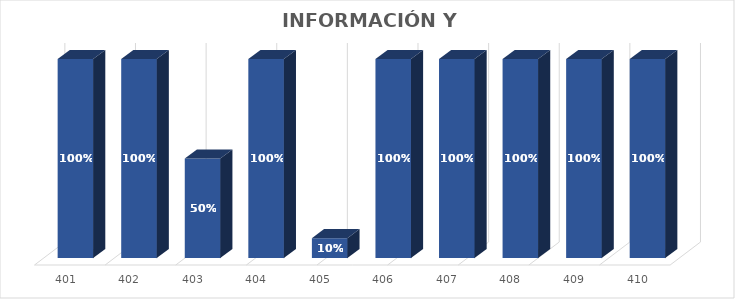
| Category | % Avance |
|---|---|
| 401.0 | 1 |
| 402.0 | 1 |
| 403.0 | 0.5 |
| 404.0 | 1 |
| 405.0 | 0.1 |
| 406.0 | 1 |
| 407.0 | 1 |
| 408.0 | 1 |
| 409.0 | 1 |
| 410.0 | 1 |